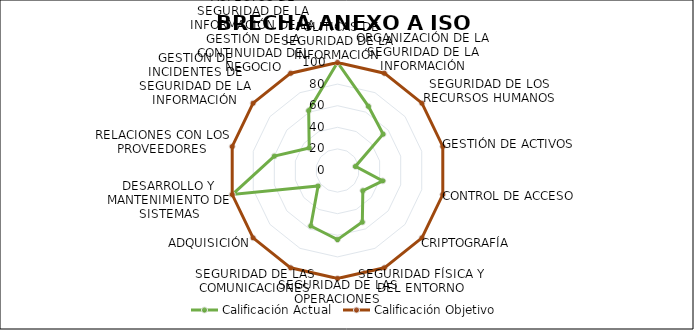
| Category | Calificación Actual | Calificación Objetivo |
|---|---|---|
| 0 | 100 | 100 |
| 1 | 66 | 100 |
| 2 | 54 | 100 |
| 3 | 17 | 100 |
| 4 | 43 | 100 |
| 5 | 30 | 100 |
| 6 | 53 | 100 |
| 7 | 64 | 100 |
| 8 | 57 | 100 |
| 9 | 23 | 100 |
| 10 | 100 | 100 |
| 11 | 60 | 100 |
| 12 | 33.5 | 100 |
| 13 | 61.5 | 100 |